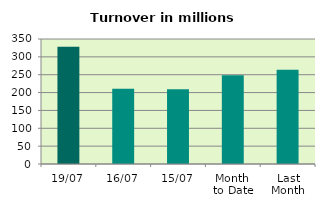
| Category | Series 0 |
|---|---|
| 19/07 | 328.608 |
| 16/07 | 210.913 |
| 15/07 | 208.961 |
| Month 
to Date | 248.442 |
| Last
Month | 264.074 |